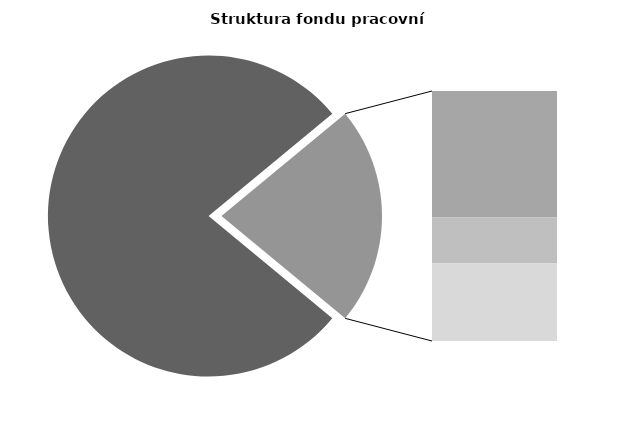
| Category | Series 0 |
|---|---|
| Průměrná měsíční odpracovaná doba bez přesčasu | 134.918 |
| Dovolená | 19.256 |
| Nemoc | 7.018 |
| Jiné | 11.777 |